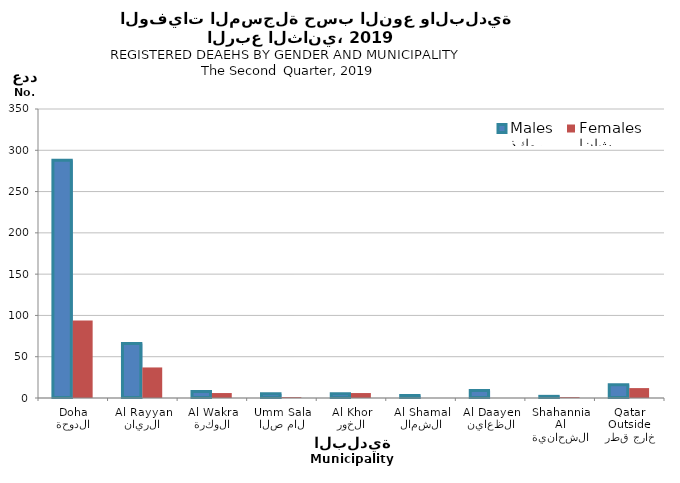
| Category | ذكور
Males | إناث
Females |
|---|---|---|
| الدوحة
Doha | 288 | 94 |
| الريان
Al Rayyan | 66 | 37 |
| الوكرة
Al Wakra | 8 | 6 |
| ام صلال
Umm Salal | 5 | 1 |
| الخور
Al Khor | 5 | 6 |
| الشمال
Al Shamal | 3 | 0 |
| الظعاين
Al Daayen | 9 | 0 |
| الشحانية
Al Shahannia | 2 | 1 |
| خارج قطر
Outside Qatar | 16 | 12 |